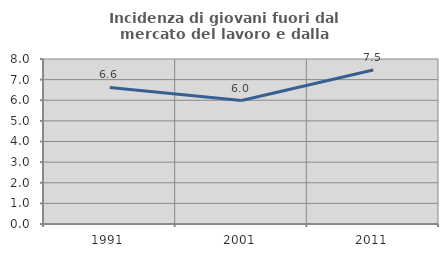
| Category | Incidenza di giovani fuori dal mercato del lavoro e dalla formazione  |
|---|---|
| 1991.0 | 6.621 |
| 2001.0 | 5.988 |
| 2011.0 | 7.466 |